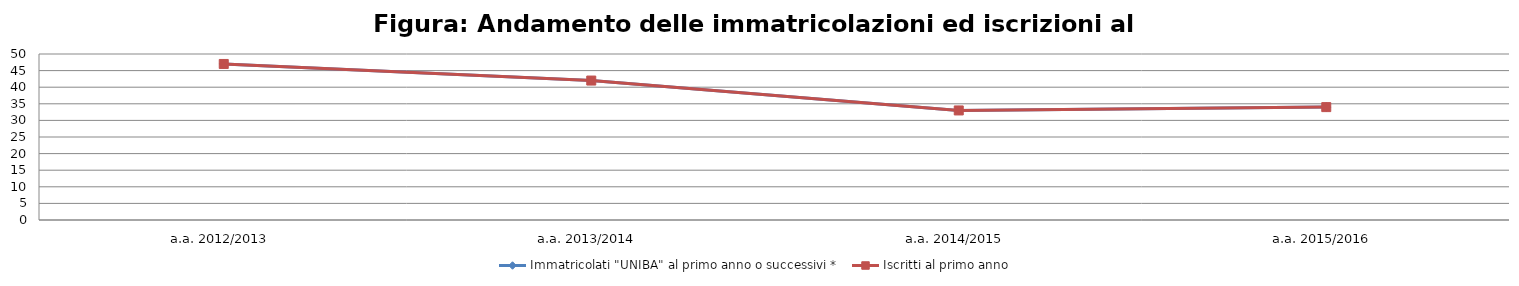
| Category | Immatricolati "UNIBA" al primo anno o successivi * | Iscritti al primo anno  |
|---|---|---|
| a.a. 2012/2013 | 47 | 47 |
| a.a. 2013/2014 | 42 | 42 |
| a.a. 2014/2015 | 33 | 33 |
| a.a. 2015/2016 | 34 | 34 |